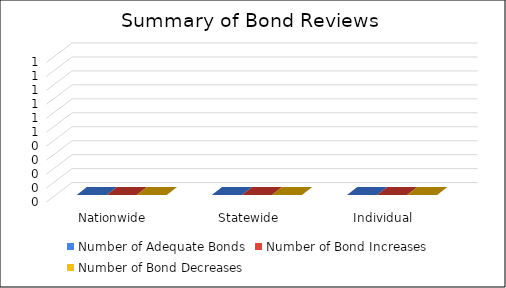
| Category | Number of Adequate Bonds | Number of Bond Increases | Number of Bond Decreases |
|---|---|---|---|
| Nationwide | 0 | 0 | 0 |
| Statewide | 0 | 0 | 0 |
| Individual | 0 | 0 | 0 |